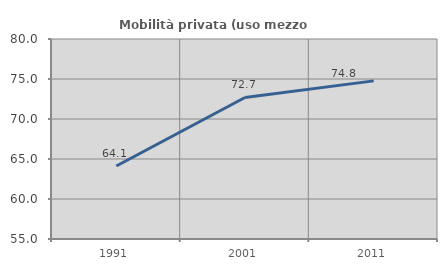
| Category | Mobilità privata (uso mezzo privato) |
|---|---|
| 1991.0 | 64.126 |
| 2001.0 | 72.691 |
| 2011.0 | 74.766 |